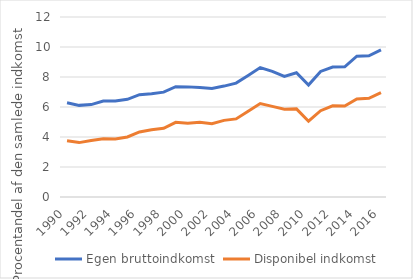
| Category | Egen bruttoindkomst | Disponibel indkomst |
|---|---|---|
| 1990 | 6.279 | 3.749 |
| 1991 | 6.109 | 3.627 |
| 1992 | 6.159 | 3.77 |
| 1993 | 6.399 | 3.878 |
| 1994 | 6.395 | 3.87 |
| 1995 | 6.511 | 4 |
| 1996 | 6.819 | 4.338 |
| 1997 | 6.891 | 4.478 |
| 1998 | 6.989 | 4.579 |
| 1999 | 7.357 | 4.976 |
| 2000 | 7.342 | 4.918 |
| 2001 | 7.297 | 4.977 |
| 2002 | 7.241 | 4.892 |
| 2003 | 7.394 | 5.108 |
| 2004 | 7.592 | 5.207 |
| 2005 | 8.098 | 5.72 |
| 2006 | 8.627 | 6.234 |
| 2007 | 8.375 | 6.043 |
| 2008 | 8.043 | 5.852 |
| 2009 | 8.283 | 5.874 |
| 2010 | 7.463 | 5.051 |
| 2011 | 8.373 | 5.751 |
| 2012 | 8.664 | 6.078 |
| 2013 | 8.679 | 6.059 |
| 2014 | 9.387 | 6.536 |
| 2015 | 9.413 | 6.577 |
| 2016 | 9.806 | 6.957 |